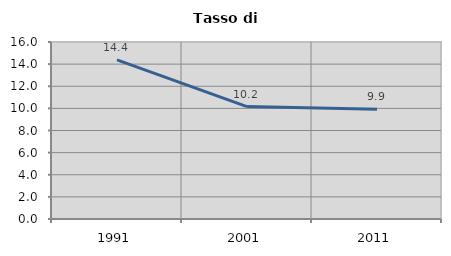
| Category | Tasso di disoccupazione   |
|---|---|
| 1991.0 | 14.388 |
| 2001.0 | 10.164 |
| 2011.0 | 9.917 |